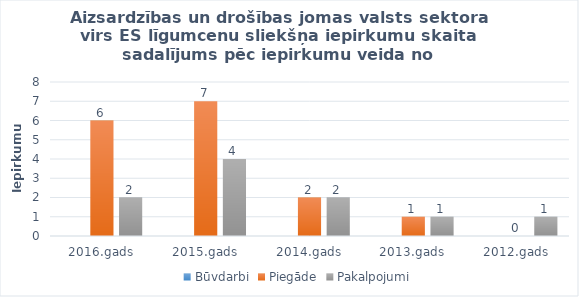
| Category | Būvdarbi | Piegāde | Pakalpojumi |
|---|---|---|---|
| 2016.gads | 0 | 6 | 2 |
| 2015.gads | 0 | 7 | 4 |
| 2014.gads | 0 | 2 | 2 |
| 2013.gads | 0 | 1 | 1 |
| 2012.gads | 0 | 0 | 1 |